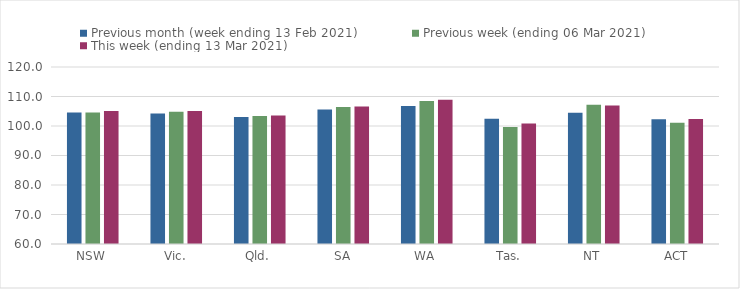
| Category | Previous month (week ending 13 Feb 2021) | Previous week (ending 06 Mar 2021) | This week (ending 13 Mar 2021) |
|---|---|---|---|
| NSW | 104.61 | 104.59 | 105.09 |
| Vic. | 104.21 | 104.85 | 105.11 |
| Qld. | 103.03 | 103.35 | 103.58 |
| SA | 105.61 | 106.46 | 106.59 |
| WA | 106.75 | 108.47 | 108.94 |
| Tas. | 102.48 | 99.69 | 100.88 |
| NT | 104.49 | 107.23 | 106.97 |
| ACT | 102.33 | 101.14 | 102.36 |